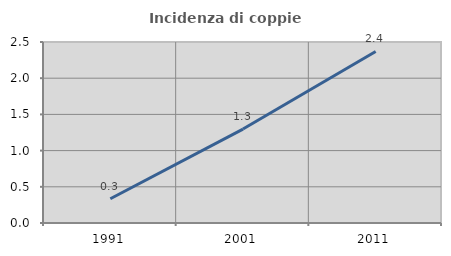
| Category | Incidenza di coppie miste |
|---|---|
| 1991.0 | 0.335 |
| 2001.0 | 1.297 |
| 2011.0 | 2.369 |